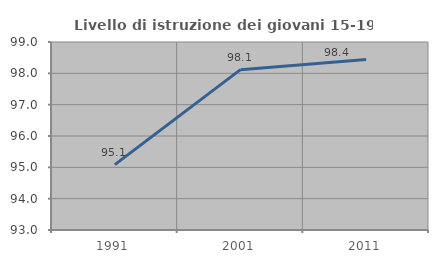
| Category | Livello di istruzione dei giovani 15-19 anni |
|---|---|
| 1991.0 | 95.087 |
| 2001.0 | 98.118 |
| 2011.0 | 98.441 |